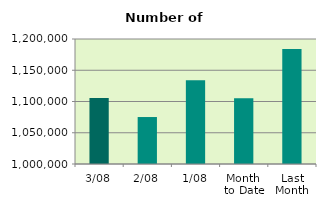
| Category | Series 0 |
|---|---|
| 3/08 | 1105708 |
| 2/08 | 1075150 |
| 1/08 | 1134180 |
| Month 
to Date | 1105012.667 |
| Last
Month | 1183989.81 |